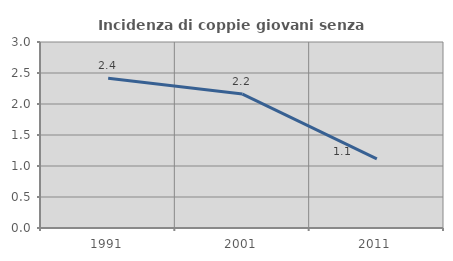
| Category | Incidenza di coppie giovani senza figli |
|---|---|
| 1991.0 | 2.417 |
| 2001.0 | 2.16 |
| 2011.0 | 1.115 |